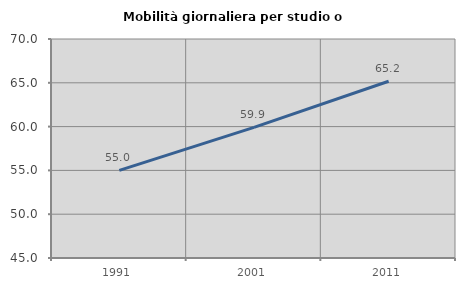
| Category | Mobilità giornaliera per studio o lavoro |
|---|---|
| 1991.0 | 55.01 |
| 2001.0 | 59.913 |
| 2011.0 | 65.18 |